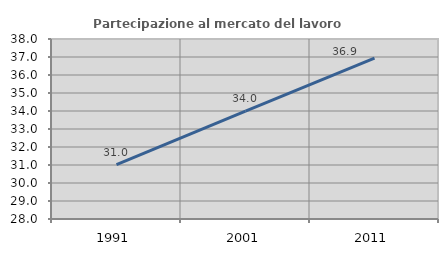
| Category | Partecipazione al mercato del lavoro  femminile |
|---|---|
| 1991.0 | 31.022 |
| 2001.0 | 33.993 |
| 2011.0 | 36.932 |